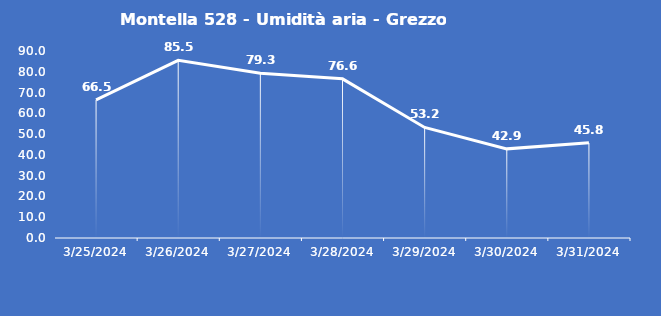
| Category | Montella 528 - Umidità aria - Grezzo (%) |
|---|---|
| 3/25/24 | 66.5 |
| 3/26/24 | 85.5 |
| 3/27/24 | 79.3 |
| 3/28/24 | 76.6 |
| 3/29/24 | 53.2 |
| 3/30/24 | 42.9 |
| 3/31/24 | 45.8 |